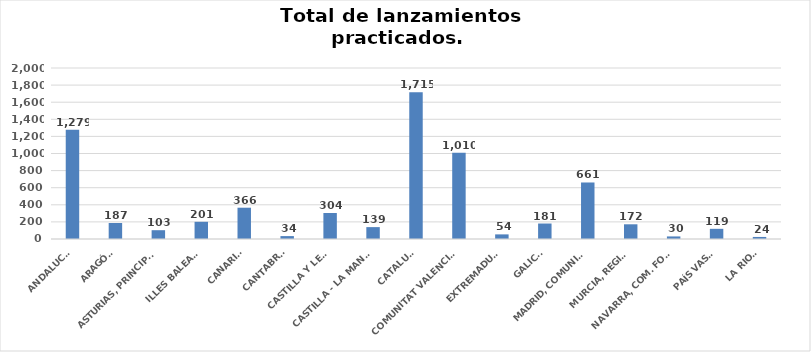
| Category | Series 0 |
|---|---|
| ANDALUCÍA | 1279 |
| ARAGÓN | 187 |
| ASTURIAS, PRINCIPADO | 103 |
| ILLES BALEARS | 201 |
| CANARIAS | 366 |
| CANTABRIA | 34 |
| CASTILLA Y LEÓN | 304 |
| CASTILLA - LA MANCHA | 139 |
| CATALUÑA | 1715 |
| COMUNITAT VALENCIANA | 1010 |
| EXTREMADURA | 54 |
| GALICIA | 181 |
| MADRID, COMUNIDAD | 661 |
| MURCIA, REGIÓN | 172 |
| NAVARRA, COM. FORAL | 30 |
| PAÍS VASCO | 119 |
| LA RIOJA | 24 |